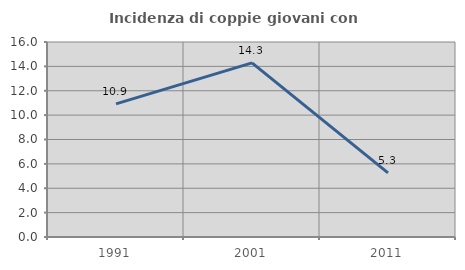
| Category | Incidenza di coppie giovani con figli |
|---|---|
| 1991.0 | 10.924 |
| 2001.0 | 14.286 |
| 2011.0 | 5.263 |